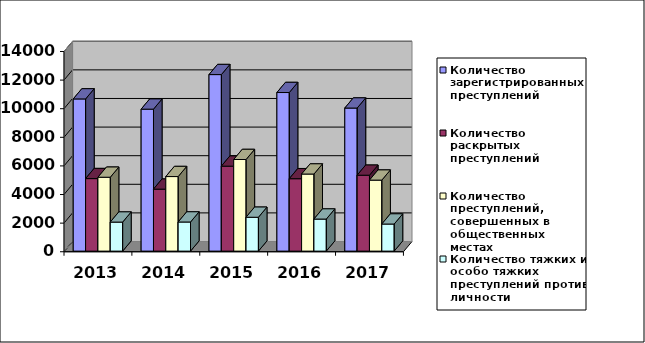
| Category | Количество зарегистрированных преступлений | Количество раскрытых преступлений | Количество преступлений в общественных местах | Количество тяжких и особо тяжких преступлений против личности | Количество преступлений, совершенных в общественных местах |
|---|---|---|---|---|---|
| 2013.0 | 10639 | 5069 |  | 2030 | 5166 |
| 2014.0 | 9925 | 4332 |  | 2035 | 5213 |
| 2015.0 | 12341 | 5940 |  | 2367 | 6404 |
| 2016.0 | 11087 | 5062 |  | 2240 | 5388 |
| 2017.0 | 10001 | 5306 |  | 1893 | 4963 |